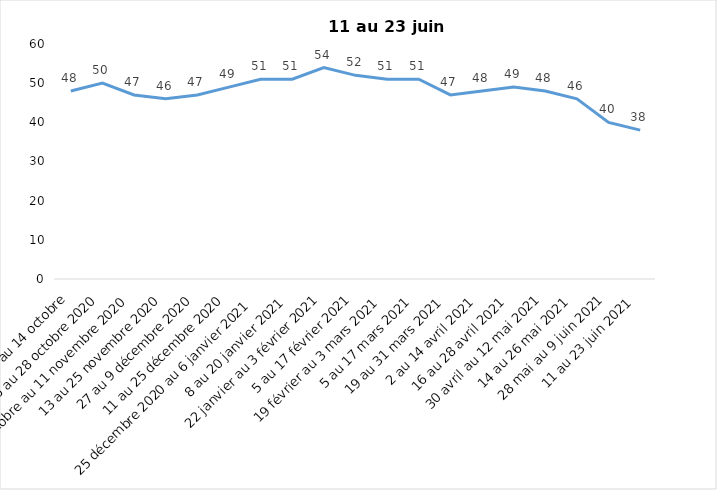
| Category | Toujours aux trois mesures |
|---|---|
| 2 au 14 octobre | 48 |
| 16 au 28 octobre 2020 | 50 |
| 30 octobre au 11 novembre 2020 | 47 |
| 13 au 25 novembre 2020 | 46 |
| 27 au 9 décembre 2020 | 47 |
| 11 au 25 décembre 2020 | 49 |
| 25 décembre 2020 au 6 janvier 2021 | 51 |
| 8 au 20 janvier 2021 | 51 |
| 22 janvier au 3 février 2021 | 54 |
| 5 au 17 février 2021 | 52 |
| 19 février au 3 mars 2021 | 51 |
| 5 au 17 mars 2021 | 51 |
| 19 au 31 mars 2021 | 47 |
| 2 au 14 avril 2021 | 48 |
| 16 au 28 avril 2021 | 49 |
| 30 avril au 12 mai 2021 | 48 |
| 14 au 26 mai 2021 | 46 |
| 28 mai au 9 juin 2021 | 40 |
| 11 au 23 juin 2021 | 38 |